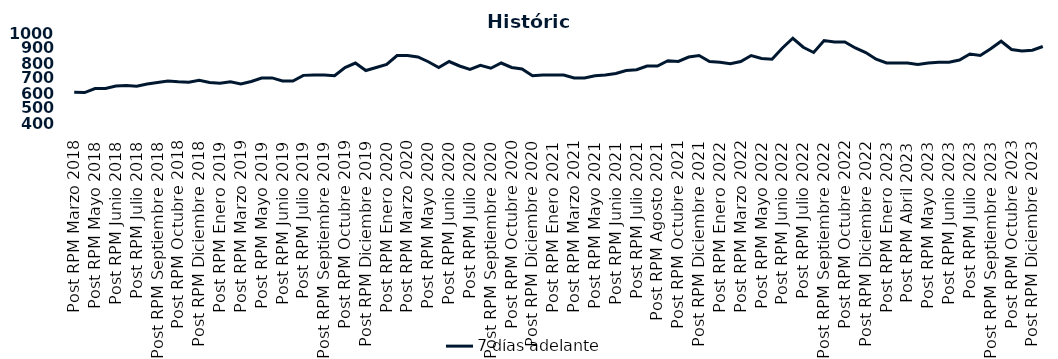
| Category | 7 días adelante  |
|---|---|
| Post RPM Marzo 2018 | 605 |
| Pre RPM Mayo 2018 | 603 |
| Post RPM Mayo 2018 | 630 |
| Pre RPM Junio 2018 | 630 |
| Post RPM Junio 2018 | 646.5 |
| Pre RPM Julio 2018 | 650 |
| Post RPM Julio 2018 | 645 |
| Pre RPM Septiembre 2018 | 660 |
| Post RPM Septiembre 2018 | 670 |
| Pre RPM Octubre 2018 | 680 |
| Post RPM Octubre 2018 | 675 |
| Pre RPM Diciembre 2018 | 672.5 |
| Post RPM Diciembre 2018 | 685 |
| Pre RPM Enero 2019 | 670 |
| Post RPM Enero 2019 | 665 |
| Pre RPM Marzo 2019 | 675 |
| Post RPM Marzo 2019 | 661 |
| Pre RPM Mayo 2019 | 677 |
| Post RPM Mayo 2019 | 700 |
| Pre RPM Junio 2019 | 700.5 |
| Post RPM Junio 2019 | 680 |
| Pre RPM Julio 2019 | 680 |
| Post RPM Julio 2019 | 717.5 |
| Pre RPM Septiembre 2019 | 720 |
| Post RPM Septiembre 2019 | 720 |
| Pre RPM Octubre 2019 | 715 |
| Post RPM Octubre 2019 | 770 |
| Pre RPM Diciembre 2019 | 800 |
| Post RPM Diciembre 2019 | 750 |
| Pre RPM Enero 2020 | 770 |
| Post RPM Enero 2020 | 790 |
| Pre RPM Marzo 2020 | 850 |
| Post RPM Marzo 2020 | 850 |
| Pre RPM Mayo 2020 | 840 |
| Post RPM Mayo 2020 | 808.5 |
| Pre RPM Junio 2020 | 770 |
| Post RPM Junio 2020 | 810 |
| Pre RPM Julio 2020 | 780 |
| Post RPM Julio 2020 | 757 |
| Pre RPM Septiembre 2020 | 785 |
| Post RPM Septiembre 2020 | 765 |
| Pre RPM Octubre 2020 | 800 |
| Post RPM Octubre 2020 | 770 |
| Pre RPM Diciembre 2020 | 760 |
| Post RPM Diciembre 2020 | 715 |
| Pre RPM Enero 2021 | 720 |
| Post RPM Enero 2021 | 720 |
| Pre RPM Marzo 2021 | 720 |
| Post RPM Marzo 2021 | 700 |
| Pre RPM Mayo 2021 | 700 |
| Post RPM Mayo 2021 | 715 |
| Pre RPM Junio 2021 | 720 |
| Post RPM Junio 2021 | 730 |
| Pre RPM Julio 2021 | 750 |
| Post RPM Julio 2021 | 755 |
| Pre RPM Agosto 2021 | 780 |
| Post RPM Agosto 2021 | 780 |
| Pre RPM Octubre 2021 | 815 |
| Post RPM Octubre 2021 | 810 |
| Pre RPM Diciembre 2021 | 840 |
| Post RPM Diciembre 2021 | 850 |
| Pre RPM Enero 2022 | 810 |
| Post RPM Enero 2022 | 805 |
| Pre RPM Marzo 2022 | 795 |
| Post RPM Marzo 2022 | 810 |
| Pre RPM Mayo 2022 | 850 |
| Post RPM Mayo 2022 | 830 |
| Pre RPM Junio 2022 | 825 |
| Post RPM Junio 2022 | 900 |
| Pre RPM Julio 2022 | 965 |
| Post RPM Julio 2022 | 905 |
| Pre RPM Septiembre 2022 | 870 |
| Post RPM Septiembre 2022 | 950 |
| Pre RPM Octubre 2022 | 940 |
| Post RPM Octubre 2022 | 940 |
| Pre RPM Diciembre 2022 | 900 |
| Post RPM Diciembre 2022 | 870 |
| Pre RPM Enero 2023 | 825 |
| Post RPM Enero 2023 | 800 |
| Pre RPM Abril 2023 | 800 |
| Post RPM Abril 2023 | 800 |
| Pre RPM Mayo 2023 | 790 |
| Post RPM Mayo 2023 | 800 |
| Pre RPM Junio 2023 | 805 |
| Post RPM Junio 2023 | 805 |
| Pre RPM Julio 2023 | 820 |
| Post RPM Julio 2023 | 860 |
| Pre RPM Septiembre 2023 | 850 |
| Post RPM Septiembre 2023 | 895 |
| Pre RPM Octubre 2023 | 945 |
| Post RPM Octubre 2023 | 890 |
| Pre RPM Diciembre 2023 | 880 |
| Post RPM Diciembre 2023 | 885 |
| Pre RPM Enero 2024 | 910 |